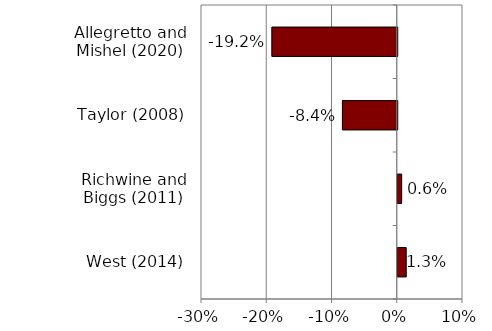
| Category | Series 0 |
|---|---|
| West (2014) | 0.013 |
| Richwine and Biggs (2011) | 0.006 |
| Taylor (2008) | -0.084 |
| Allegretto and Mishel (2020) | -0.192 |